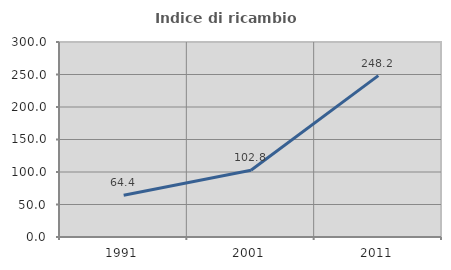
| Category | Indice di ricambio occupazionale  |
|---|---|
| 1991.0 | 64.362 |
| 2001.0 | 102.799 |
| 2011.0 | 248.227 |